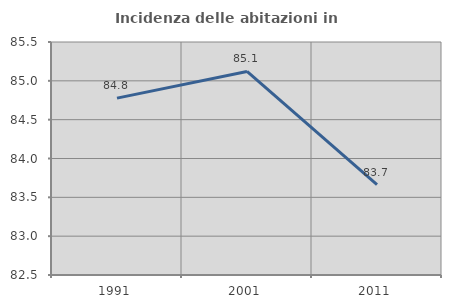
| Category | Incidenza delle abitazioni in proprietà  |
|---|---|
| 1991.0 | 84.777 |
| 2001.0 | 85.121 |
| 2011.0 | 83.665 |